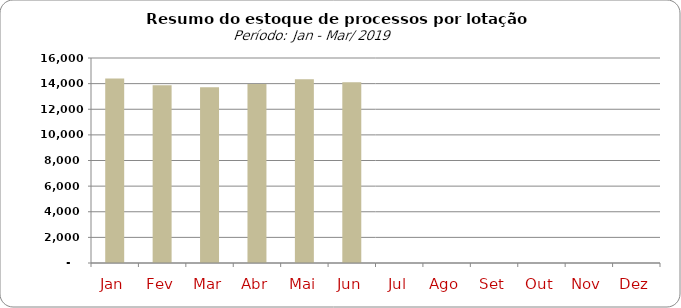
| Category | Series 0 |
|---|---|
| Jan | 14401 |
| Fev | 13878 |
| Mar | 13715 |
| Abr | 13963 |
| Mai | 14333 |
| Jun | 14111 |
| Jul | 0 |
| Ago | 0 |
| Set | 0 |
| Out | 0 |
| Nov | 0 |
| Dez | 0 |